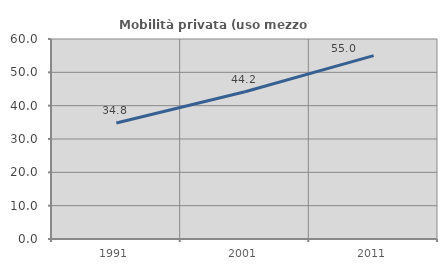
| Category | Mobilità privata (uso mezzo privato) |
|---|---|
| 1991.0 | 34.797 |
| 2001.0 | 44.164 |
| 2011.0 | 55 |